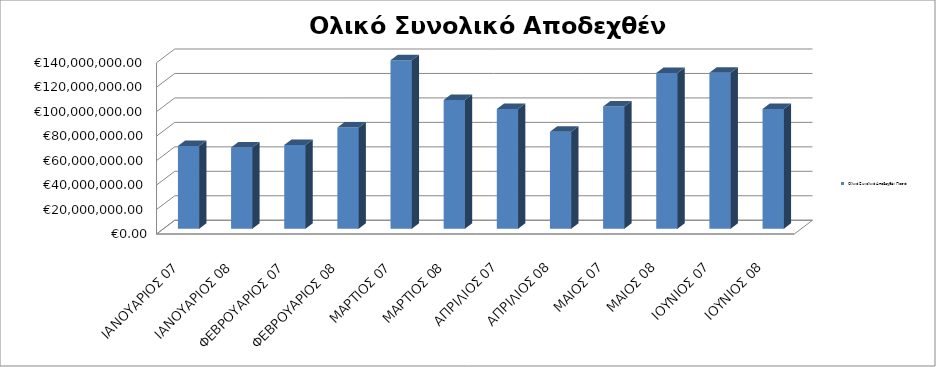
| Category | Ολικό Συνολικό Αποδεχθέν Ποσό: |
|---|---|
| ΙΑΝΟΥΑΡΙΟΣ 07 | 67592086.66 |
| ΙΑΝΟΥΑΡΙΟΣ 08 | 66397053.54 |
| ΦΕΒΡΟΥΑΡΙΟΣ 07 | 68444210.5 |
| ΦΕΒΡΟΥΑΡΙΟΣ 08 | 82751902.05 |
| ΜΑΡΤΙΟΣ 07 | 137789818.04 |
| ΜΑΡΤΙΟΣ 08 | 105230693.11 |
| ΑΠΡΙΛΙΟΣ 07 | 97935602.72 |
| ΑΠΡΙΛΙΟΣ 08 | 79349216.54 |
| ΜΑΙΟΣ 07 | 99878588.27 |
| ΜΑΙΟΣ 08 | 127232369.65 |
| ΙΟΥΝΙΟΣ 07 | 127474522.03 |
| ΙΟΥΝΙΟΣ 08 | 97876828.94 |